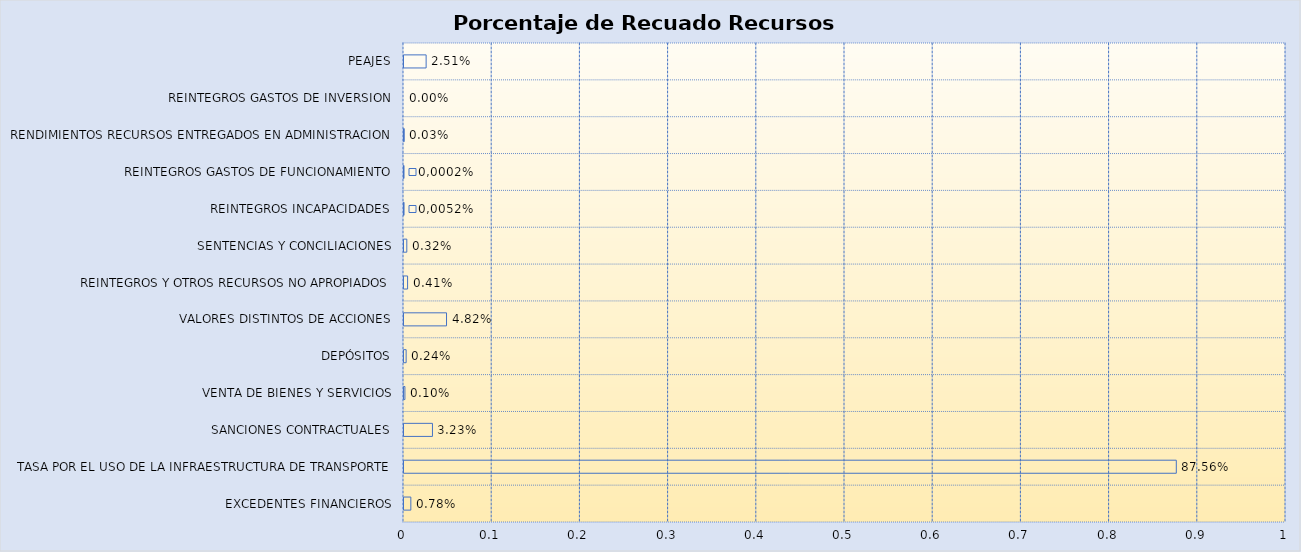
| Category | Total |
|---|---|
| EXCEDENTES FINANCIEROS | 0.008 |
| TASA POR EL USO DE LA INFRAESTRUCTURA DE TRANSPORTE | 0.876 |
| SANCIONES CONTRACTUALES | 0.032 |
| VENTA DE BIENES Y SERVICIOS | 0.001 |
| DEPÓSITOS | 0.002 |
| VALORES DISTINTOS DE ACCIONES | 0.048 |
| REINTEGROS Y OTROS RECURSOS NO APROPIADOS | 0.004 |
| SENTENCIAS Y CONCILIACIONES | 0.003 |
| REINTEGROS INCAPACIDADES | 0 |
| REINTEGROS GASTOS DE FUNCIONAMIENTO | 0 |
| RENDIMIENTOS RECURSOS ENTREGADOS EN ADMINISTRACION | 0 |
| REINTEGROS GASTOS DE INVERSION | 0 |
| PEAJES | 0.025 |